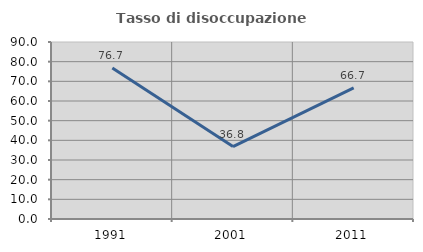
| Category | Tasso di disoccupazione giovanile  |
|---|---|
| 1991.0 | 76.744 |
| 2001.0 | 36.842 |
| 2011.0 | 66.667 |